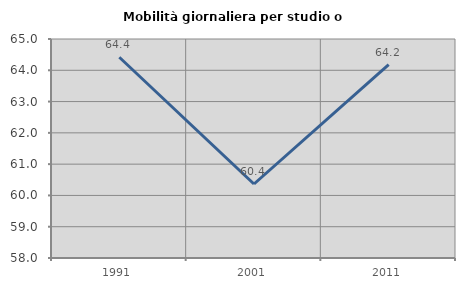
| Category | Mobilità giornaliera per studio o lavoro |
|---|---|
| 1991.0 | 64.417 |
| 2001.0 | 60.365 |
| 2011.0 | 64.185 |